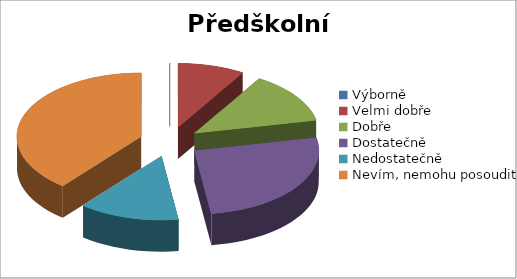
| Category | Předškolní zařízení |
|---|---|
| Výborně | 0 |
| Velmi dobře | 2 |
| Dobře | 3 |
| Dostatečně | 6 |
| Nedostatečně | 3 |
| Nevím, nemohu posoudit | 9 |